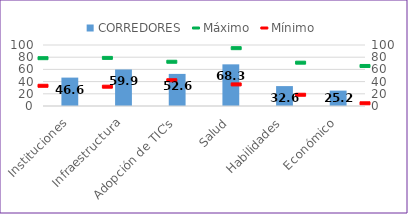
| Category | CORREDORES |
|---|---|
| Instituciones | 46.556 |
| Infraestructura | 59.886 |
| Adopción de TIC's | 52.617 |
| Salud | 68.297 |
| Habilidades | 32.618 |
| Económico | 25.219 |